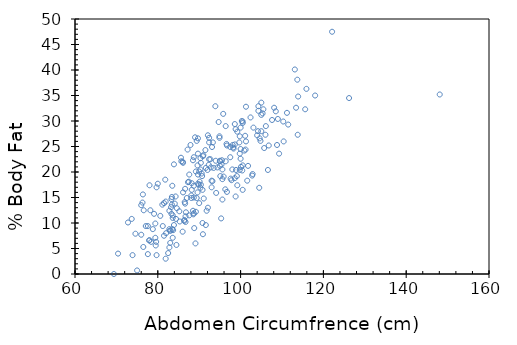
| Category | Series 0 |
|---|---|
| 85.2 | 12.3 |
| 83.0 | 6.1 |
| 87.9 | 25.3 |
| 86.4 | 10.4 |
| 100.0 | 28.7 |
| 94.4 | 20.9 |
| 90.7 | 19.2 |
| 88.5 | 12.4 |
| 82.5 | 4.1 |
| 88.6 | 11.7 |
| 83.6 | 7.1 |
| 90.9 | 7.8 |
| 91.6 | 20.8 |
| 101.8 | 21.2 |
| 96.4 | 22.1 |
| 92.8 | 20.9 |
| 96.4 | 29 |
| 97.5 | 22.9 |
| 89.6 | 16 |
| 100.5 | 16.5 |
| 95.9 | 19.1 |
| 98.8 | 15.2 |
| 76.4 | 15.6 |
| 80.0 | 17.7 |
| 76.3 | 14 |
| 79.7 | 3.7 |
| 74.6 | 7.9 |
| 88.7 | 22.9 |
| 73.9 | 3.7 |
| 83.5 | 8.8 |
| 88.7 | 11.9 |
| 84.5 | 5.7 |
| 79.1 | 11.8 |
| 100.5 | 21.3 |
| 115.6 | 32.3 |
| 113.1 | 40.1 |
| 100.9 | 24.2 |
| 98.8 | 28.4 |
| 148.1 | 35.2 |
| 108.1 | 32.6 |
| 126.2 | 34.5 |
| 104.3 | 32.9 |
| 111.2 | 31.6 |
| 104.3 | 32 |
| 76.0 | 7.7 |
| 81.5 | 13.9 |
| 73.7 | 10.8 |
| 79.5 | 5.6 |
| 83.4 | 13.6 |
| 70.4 | 4 |
| 86.7 | 10.2 |
| 77.9 | 6.6 |
| 82.0 | 8 |
| 79.6 | 6.3 |
| 77.6 | 3.9 |
| 100.0 | 22.6 |
| 99.8 | 20.4 |
| 104.2 | 28 |
| 105.3 | 31.5 |
| 98.3 | 24.6 |
| 104.8 | 26.1 |
| 94.7 | 29.8 |
| 102.4 | 30.7 |
| 99.7 | 25.8 |
| 105.5 | 32.3 |
| 100.3 | 30 |
| 83.9 | 21.5 |
| 86.6 | 13.8 |
| 78.4 | 6.3 |
| 84.6 | 12.9 |
| 91.5 | 24.3 |
| 82.8 | 8.8 |
| 82.9 | 8.5 |
| 76.0 | 13.5 |
| 83.3 | 11.8 |
| 81.8 | 18.5 |
| 78.8 | 8.8 |
| 95.0 | 22.2 |
| 95.4 | 21.5 |
| 98.6 | 18.8 |
| 95.8 | 31.4 |
| 89.0 | 26.8 |
| 97.8 | 18.4 |
| 94.9 | 27 |
| 99.8 | 27 |
| 89.7 | 26.6 |
| 88.1 | 14.9 |
| 90.9 | 23.1 |
| 86.0 | 8.3 |
| 86.5 | 14.1 |
| 95.6 | 20.5 |
| 93.2 | 18.2 |
| 83.1 | 8.5 |
| 97.5 | 24.9 |
| 88.8 | 9 |
| 99.2 | 17.4 |
| 91.6 | 9.6 |
| 86.7 | 11.3 |
| 88.2 | 17.8 |
| 94.0 | 22.2 |
| 95.0 | 21.2 |
| 92.0 | 20.4 |
| 89.2 | 20.1 |
| 95.5 | 22.3 |
| 98.6 | 25.4 |
| 87.3 | 18 |
| 102.8 | 19.3 |
| 101.6 | 18.3 |
| 88.7 | 17.3 |
| 92.3 | 21.4 |
| 90.6 | 19.7 |
| 105.0 | 28 |
| 95.0 | 22.1 |
| 89.6 | 21.3 |
| 92.4 | 26.7 |
| 86.6 | 16.7 |
| 90.0 | 20.1 |
| 90.0 | 13.9 |
| 92.4 | 25.8 |
| 87.5 | 18.1 |
| 99.2 | 27.9 |
| 98.1 | 25.3 |
| 83.3 | 14.7 |
| 86.1 | 16 |
| 84.1 | 13.8 |
| 89.9 | 17.5 |
| 92.1 | 27.2 |
| 78.0 | 17.4 |
| 93.5 | 20.8 |
| 87.0 | 14.9 |
| 90.1 | 18.1 |
| 90.3 | 22.7 |
| 99.8 | 23.6 |
| 89.4 | 26.1 |
| 87.2 | 24.4 |
| 101.1 | 27.1 |
| 86.1 | 21.8 |
| 98.6 | 29.4 |
| 88.5 | 22.3 |
| 106.6 | 20.4 |
| 93.1 | 24.9 |
| 93.0 | 18.3 |
| 91.0 | 23.3 |
| 77.1 | 9.4 |
| 85.3 | 10.3 |
| 81.9 | 14.2 |
| 99.1 | 19.2 |
| 100.5 | 29.6 |
| 76.5 | 5.3 |
| 106.8 | 25.2 |
| 77.6 | 9.4 |
| 102.9 | 19.6 |
| 72.8 | 10.1 |
| 88.2 | 16.5 |
| 100.1 | 21 |
| 83.5 | 17.3 |
| 105.0 | 31.2 |
| 90.8 | 10 |
| 76.6 | 12.5 |
| 92.4 | 22.5 |
| 81.2 | 9.4 |
| 95.6 | 14.6 |
| 92.1 | 13 |
| 83.4 | 15.1 |
| 106.0 | 27.3 |
| 95.1 | 19.2 |
| 90.4 | 21.8 |
| 100.4 | 20.3 |
| 115.9 | 36.3 |
| 90.8 | 16.5 |
| 81.9 | 3 |
| 75.0 | 0.7 |
| 90.3 | 20.5 |
| 90.3 | 16.9 |
| 108.8 | 25.3 |
| 79.4 | 9.9 |
| 83.2 | 13.1 |
| 110.3 | 29.9 |
| 92.7 | 22.5 |
| 104.5 | 16.9 |
| 104.6 | 26.6 |
| 69.4 | 0 |
| 83.6 | 11.5 |
| 86.8 | 12.1 |
| 90.4 | 17.5 |
| 83.7 | 8.6 |
| 109.3 | 23.6 |
| 98.9 | 20.4 |
| 98.0 | 20.5 |
| 101.2 | 24.4 |
| 80.6 | 11.4 |
| 113.7 | 38.1 |
| 94.1 | 15.9 |
| 105.7 | 24.7 |
| 85.6 | 22.8 |
| 96.6 | 25.5 |
| 86.0 | 22 |
| 89.7 | 17.7 |
| 78.0 | 6.6 |
| 89.7 | 23.6 |
| 89.2 | 12.2 |
| 85.7 | 22.1 |
| 103.1 | 28.7 |
| 89.1 | 6 |
| 113.9 | 34.8 |
| 96.3 | 16.6 |
| 93.9 | 32.9 |
| 101.3 | 32.8 |
| 83.9 | 9.6 |
| 84.4 | 10.8 |
| 79.4 | 7.1 |
| 104.0 | 27.2 |
| 89.7 | 19.5 |
| 97.6 | 18.7 |
| 87.6 | 19.5 |
| 122.1 | 47.5 |
| 81.1 | 13.6 |
| 81.5 | 7.5 |
| 100.0 | 24.5 |
| 88.7 | 15 |
| 91.8 | 12.4 |
| 110.4 | 26 |
| 87.6 | 11.5 |
| 82.8 | 5.2 |
| 95.3 | 10.9 |
| 78.2 | 12.5 |
| 91.1 | 14.8 |
| 96.7 | 25.2 |
| 89.4 | 14.9 |
| 93.0 | 17 |
| 86.4 | 10.6 |
| 96.7 | 16.1 |
| 88.1 | 15.4 |
| 94.9 | 26.7 |
| 93.3 | 25.8 |
| 95.6 | 18.6 |
| 98.2 | 24.8 |
| 113.8 | 27.3 |
| 82.8 | 12.4 |
| 100.5 | 29.9 |
| 79.7 | 17 |
| 118.0 | 35 |
| 109.0 | 30.4 |
| 113.4 | 32.6 |
| 106.1 | 29 |
| 84.3 | 15.2 |
| 107.6 | 30.2 |
| 83.6 | 11 |
| 105.0 | 33.6 |
| 111.5 | 29.3 |
| 101.3 | 26 |
| 108.5 | 31.9 |